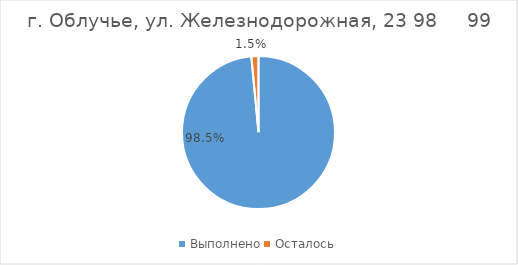
| Category | г. Облучье, ул. Железнодорожная, 23 |
|---|---|
| Выполнено | 0.985 |
| Осталось | 0.015 |